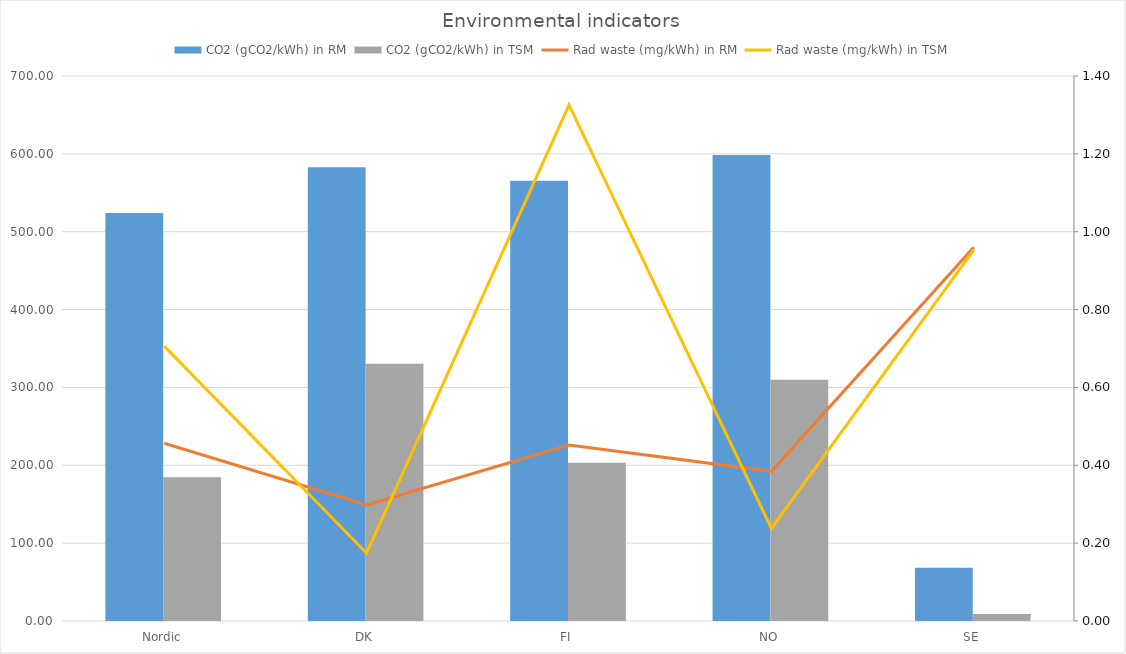
| Category | CO2 (gCO2/kWh) in RM | CO2 (gCO2/kWh) in TSM |
|---|---|---|
| Nordic | 524.096 | 184.742 |
| DK | 582.748 | 330.294 |
| FI | 565.305 | 203.13 |
| NO | 598.609 | 309.839 |
| SE | 68.235 | 9.058 |